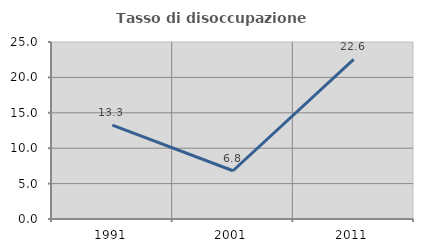
| Category | Tasso di disoccupazione giovanile  |
|---|---|
| 1991.0 | 13.27 |
| 2001.0 | 6.814 |
| 2011.0 | 22.558 |